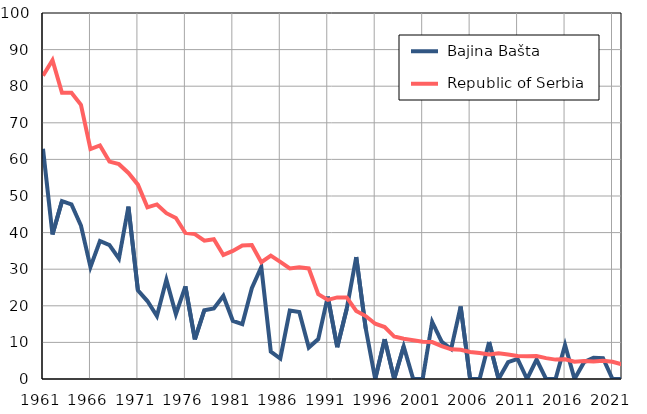
| Category |  Bajina Bašta |  Republic of Serbia |
|---|---|---|
| 1961.0 | 62.9 | 82.9 |
| 1962.0 | 39.5 | 87.1 |
| 1963.0 | 48.6 | 78.2 |
| 1964.0 | 47.7 | 78.2 |
| 1965.0 | 41.9 | 74.9 |
| 1966.0 | 30.6 | 62.8 |
| 1967.0 | 37.7 | 63.8 |
| 1968.0 | 36.6 | 59.4 |
| 1969.0 | 32.9 | 58.7 |
| 1970.0 | 47.1 | 56.3 |
| 1971.0 | 24.2 | 53.1 |
| 1972.0 | 21.3 | 46.9 |
| 1973.0 | 17.2 | 47.7 |
| 1974.0 | 27.1 | 45.3 |
| 1975.0 | 17.7 | 44 |
| 1976.0 | 25.3 | 39.9 |
| 1977.0 | 10.8 | 39.6 |
| 1978.0 | 18.8 | 37.8 |
| 1979.0 | 19.3 | 38.2 |
| 1980.0 | 22.7 | 33.9 |
| 1981.0 | 15.9 | 35 |
| 1982.0 | 15 | 36.5 |
| 1983.0 | 24.8 | 36.6 |
| 1984.0 | 30.6 | 31.9 |
| 1985.0 | 7.5 | 33.7 |
| 1986.0 | 5.6 | 32 |
| 1987.0 | 18.7 | 30.2 |
| 1988.0 | 18.3 | 30.5 |
| 1989.0 | 8.6 | 30.2 |
| 1990.0 | 10.9 | 23.2 |
| 1991.0 | 22.5 | 21.6 |
| 1992.0 | 8.7 | 22.3 |
| 1993.0 | 19.2 | 22.3 |
| 1994.0 | 33.3 | 18.6 |
| 1995.0 | 13.8 | 17.2 |
| 1996.0 | 0 | 15.1 |
| 1997.0 | 10.9 | 14.2 |
| 1998.0 | 0 | 11.6 |
| 1999.0 | 8.9 | 11 |
| 2000.0 | 0 | 10.6 |
| 2001.0 | 0 | 10.2 |
| 2002.0 | 15.6 | 10.1 |
| 2003.0 | 10.2 | 9 |
| 2004.0 | 8.2 | 8.1 |
| 2005.0 | 19.8 | 8 |
| 2006.0 | 0 | 7.4 |
| 2007.0 | 0 | 7.1 |
| 2008.0 | 10.1 | 6.7 |
| 2009.0 | 0 | 7 |
| 2010.0 | 4.6 | 6.7 |
| 2011.0 | 5.5 | 6.3 |
| 2012.0 | 0 | 6.2 |
| 2013.0 | 5.3 | 6.3 |
| 2014.0 | 0 | 5.7 |
| 2015.0 | 0 | 5.3 |
| 2016.0 | 9.3 | 5.4 |
| 2017.0 | 0 | 4.7 |
| 2018.0 | 4.6 | 4.9 |
| 2019.0 | 5.8 | 4.8 |
| 2020.0 | 5.7 | 5 |
| 2021.0 | 0 | 4.7 |
| 2022.0 | 0 | 4 |